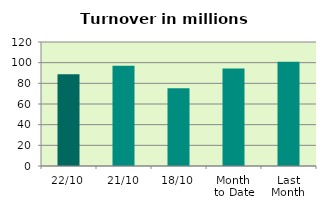
| Category | Series 0 |
|---|---|
| 22/10 | 88.713 |
| 21/10 | 97.042 |
| 18/10 | 75.212 |
| Month 
to Date | 94.462 |
| Last
Month | 100.935 |